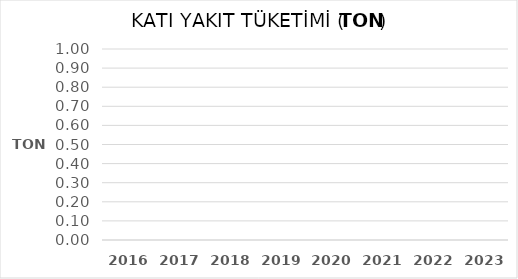
| Category | TON |
|---|---|
| 2016.0 | 0 |
| 2017.0 | 0 |
| 2018.0 | 0 |
| 2019.0 | 0 |
| 2020.0 | 0 |
| 2021.0 | 0 |
| 2022.0 | 0 |
| 2023.0 | 0 |